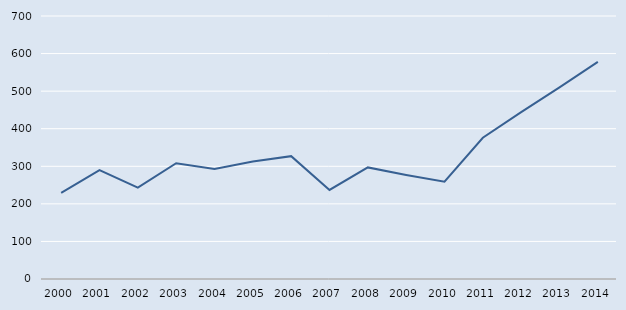
| Category | Series 0 |
|---|---|
| 2000.0 | 229 |
| 2001.0 | 290 |
| 2002.0 | 243 |
| 2003.0 | 308 |
| 2004.0 | 293 |
| 2005.0 | 313 |
| 2006.0 | 327 |
| 2007.0 | 237 |
| 2008.0 | 297 |
| 2009.0 | 277 |
| 2010.0 | 259 |
| 2011.0 | 376 |
| 2012.0 | 444 |
| 2013.0 | 510 |
| 2014.0 | 578 |